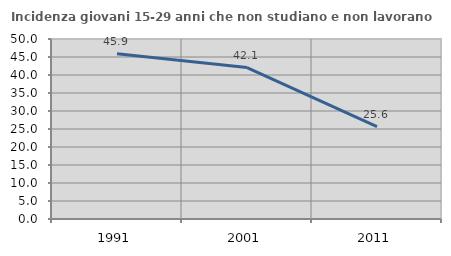
| Category | Incidenza giovani 15-29 anni che non studiano e non lavorano  |
|---|---|
| 1991.0 | 45.878 |
| 2001.0 | 42.077 |
| 2011.0 | 25.641 |